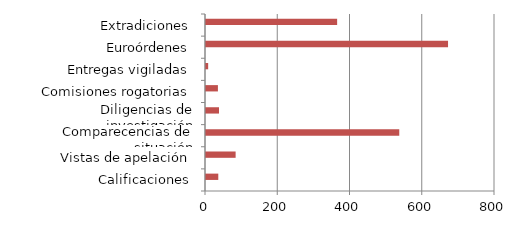
| Category | Series 0 | Series 1 |
|---|---|---|
| Calificaciones |  | 34 |
| Vistas de apelación |  | 82 |
| Comparecencias de situación |  | 535 |
| Diligencias de investigación |  | 36 |
| Comisiones rogatorias |  | 33 |
| Entregas vigiladas |  | 6 |
| Euroórdenes |  | 670 |
| Extradiciones |  | 363 |